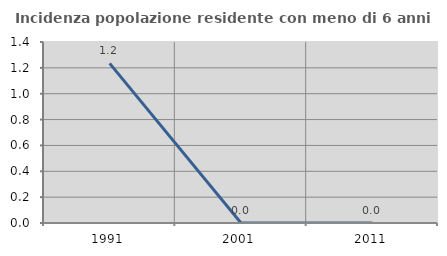
| Category | Incidenza popolazione residente con meno di 6 anni |
|---|---|
| 1991.0 | 1.235 |
| 2001.0 | 0 |
| 2011.0 | 0 |